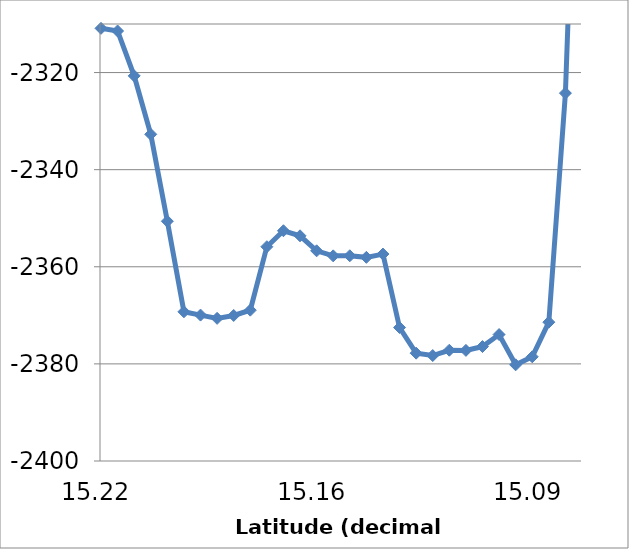
| Category | Series 0 |
|---|---|
| 15.2222 | -2310.89 |
| 15.2171 | -2311.44 |
| 15.212 | -2320.68 |
| 15.207 | -2332.72 |
| 15.2019 | -2350.62 |
| 15.1968 | -2369.27 |
| 15.1918 | -2369.95 |
| 15.1867 | -2370.62 |
| 15.1817 | -2370.03 |
| 15.1766 | -2368.94 |
| 15.1715 | -2355.87 |
| 15.1665 | -2352.58 |
| 15.1614 | -2353.62 |
| 15.1564 | -2356.71 |
| 15.1513 | -2357.75 |
| 15.1462 | -2357.73 |
| 15.1412 | -2358.06 |
| 15.1361 | -2357.38 |
| 15.131 | -2372.51 |
| 15.126 | -2377.79 |
| 15.1159 | -2378.28 |
| 15.1108 | -2377.19 |
| 15.1057 | -2377.22 |
| 15.1007 | -2376.43 |
| 15.0956 | -2373.96 |
| 15.0906 | -2380.19 |
| 15.0855 | -2378.54 |
| 15.0804 | -2371.41 |
| 15.0754 | -2324.24 |
| 15.0703 | -2229.39 |